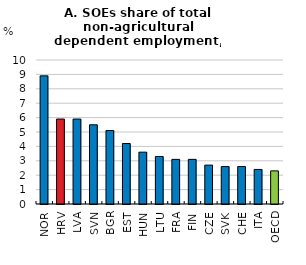
| Category | Series 0 |
|---|---|
| NOR | 8.9 |
| HRV | 5.9 |
| LVA | 5.9 |
| SVN | 5.5 |
| BGR | 5.1 |
| EST | 4.2 |
| HUN | 3.6 |
| LTU | 3.3 |
| FRA | 3.1 |
| FIN | 3.1 |
| CZE | 2.7 |
| SVK | 2.6 |
| CHE | 2.6 |
| ITA | 2.4 |
| OECD | 2.3 |